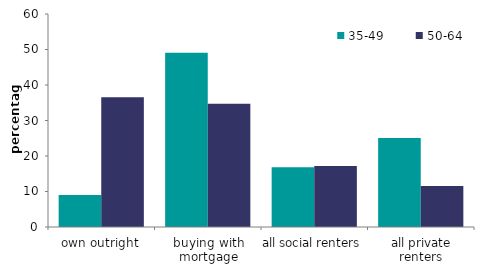
| Category | 35-49 | 50-64 |
|---|---|---|
| own outright | 9.034 | 36.55 |
| buying with mortgage | 49.095 | 34.73 |
| all social renters | 16.814 | 17.178 |
| all private renters | 25.056 | 11.542 |